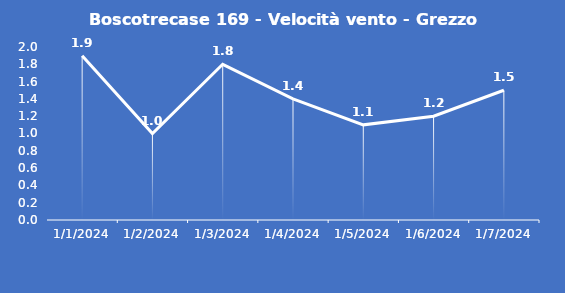
| Category | Boscotrecase 169 - Velocità vento - Grezzo (m/s) |
|---|---|
| 1/1/24 | 1.9 |
| 1/2/24 | 1 |
| 1/3/24 | 1.8 |
| 1/4/24 | 1.4 |
| 1/5/24 | 1.1 |
| 1/6/24 | 1.2 |
| 1/7/24 | 1.5 |